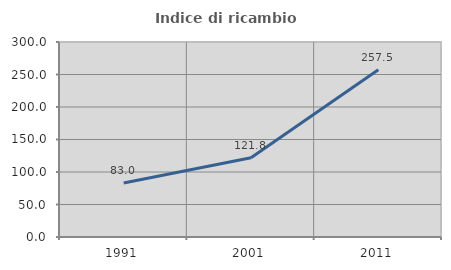
| Category | Indice di ricambio occupazionale  |
|---|---|
| 1991.0 | 83.028 |
| 2001.0 | 121.812 |
| 2011.0 | 257.471 |